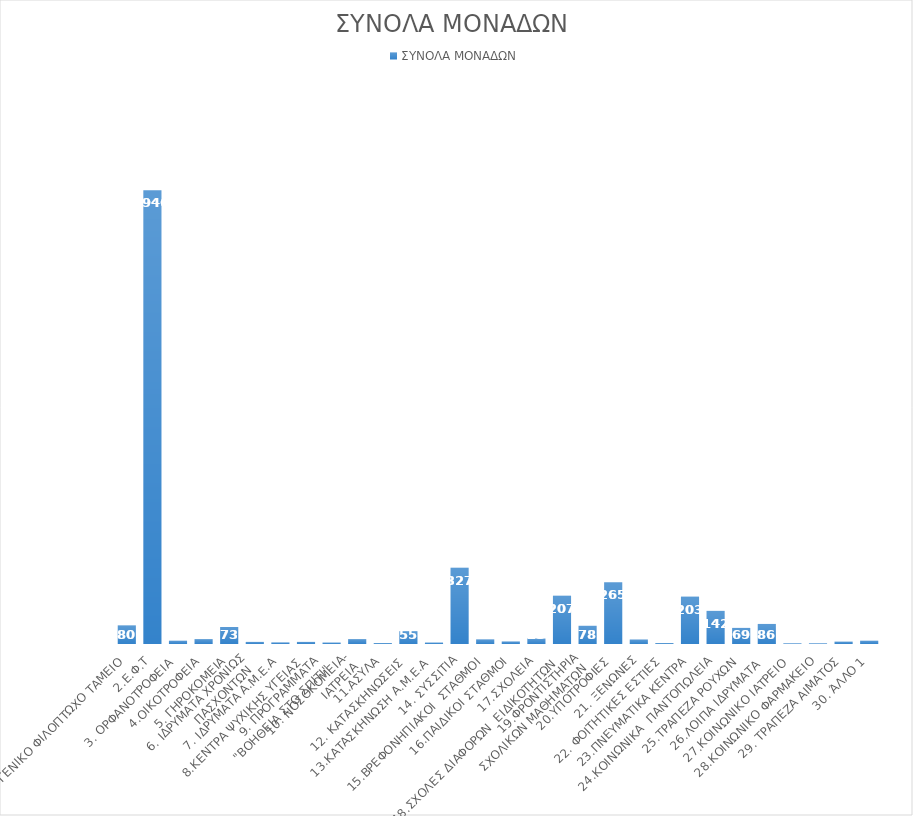
| Category | ΣΥΝΟΛΑ ΜΟΝΑΔΩΝ |
|---|---|
| 1. ΓΕΝΙΚΟ ΦΙΛΟΠΤΩΧΟ ΤΑΜΕΙΟ | 80 |
| 2.Ε.Φ.Τ | 1946 |
| 3. ΟΡΦΑΝΟΤΡΟΦΕΙΑ | 14 |
| 4.ΟΙΚΟΤΡΟΦΕΙΑ | 21 |
| 5. ΓΗΡΟΚΟΜΕΙΑ | 73 |
| 6. ΙΔΡΥΜΑΤΑ ΧΡΟΝΙΩΣ
 ΠΑΣΧΟΝΤΩΝ  | 9 |
| 7. ΙΔΡΥΜΑΤΑ Α.Μ.Ε.Α | 7 |
| 8.ΚΕΝΤΡΑ ΨΥΧΙΚΗΣ ΥΓΕΙΑΣ  | 9 |
| 9. ΠΡΟΓΡΑΜΜΑΤΑ 
"ΒΟΗΘΕΙΑ ΣΤΟ ΣΠΙΤΙ"  | 6 |
| 10. ΝΟΣΟΚΟΜΕΙΑ-
ΙΑΤΡΕΙΑ | 21 |
| 11.ΑΣΥΛΑ | 4 |
| 12. ΚΑΤΑΣΚΗΝΩΣΕΙΣ  | 55 |
| 13.ΚΑΤΑΣΚΗΝΩΣΗ Α.Μ.Ε.Α  | 6 |
| 14. ΣΥΣΣΙΤΙΑ | 327 |
| 15.ΒΡΕΦΟΝΗΠΙΑΚΟΙ  ΣΤΑΘΜΟΙ | 20 |
| 16.ΠΑΙΔΙΚΟΙ ΣΤΑΘΜΟΙ | 11 |
| 17.ΣΧΟΛΕΙΑ | 23 |
| 18.ΣΧΟΛΕΣ ΔΙΑΦΟΡΩΝ  ΕΙΔΙΚΟΤΗΤΩΝ  | 207 |
| 19.ΦΡΟΝΤΙΣΤΗΡΙΑ
 ΣΧΟΛΙΚΩΝ ΜΑΘΗΜΑΤΩΝ | 78 |
| 20.ΥΠΟΤΡΟΦΙΕΣ | 265 |
| 21. ΞΕΝΩΝΕΣ | 19 |
| 22. ΦΟΙΤΗΤΙΚΕΣ ΕΣΤΙΕΣ  | 4 |
| 23.ΠΝΕΥΜΑΤΙΚΑ ΚΕΝΤΡΑ | 203 |
| 24.ΚΟΙΝΩΝΙΚΑ  ΠΑΝΤΟΠΩΛΕΙΑ | 142 |
| 25.ΤΡΑΠΕΖΑ ΡΟΥΧΩΝ | 69 |
| 26.ΛΟΙΠΑ ΙΔΡΥΜΑΤΑ  | 86 |
| 27.ΚΟΙΝΩΝΙΚΟ ΙΑΤΡΕΙΟ  | 3 |
| 28.ΚΟΙΝΩΝΙΚΟ ΦΑΡΜΑΚΕΙΟ | 3 |
| 29. ΤΡΑΠΕΖΑ ΑΙΜΑΤΟΣ | 10 |
| 30. ΆΛΛΟ 1 | 14 |